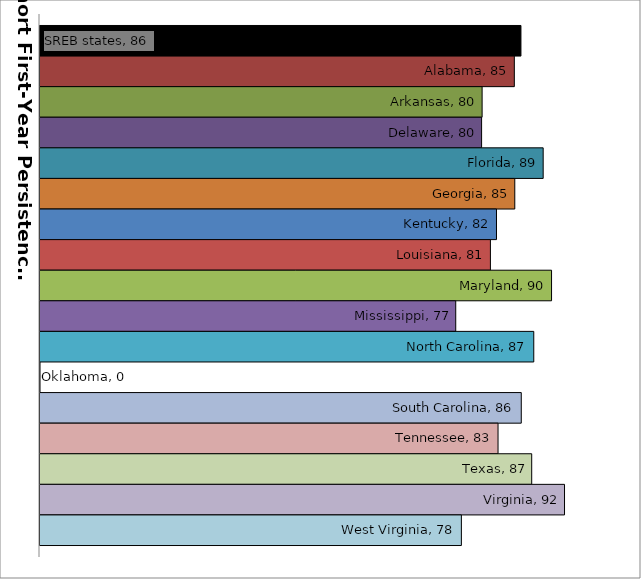
| Category | SREB states | Alabama | Arkansas | Delaware | Florida | Georgia | Kentucky | Louisiana | Maryland | Mississippi | North Carolina | Oklahoma | South Carolina | Tennessee | Texas | Virginia | West Virginia |
|---|---|---|---|---|---|---|---|---|---|---|---|---|---|---|---|---|---|
| 0 | 85.657 | 84.756 | 80.358 | 80.286 | 88.694 | 84.817 | 82.32 | 81.491 | 89.836 | 76.756 | 87.408 | 0 | 85.704 | 82.53 | 87.128 | 91.608 | 77.526 |